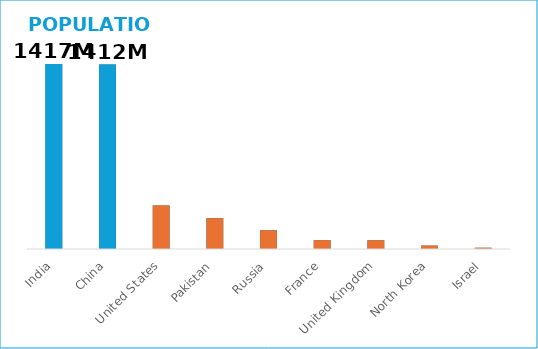
| Category | POPULATION |
|---|---|
| India | 1417173173 |
| China | 1412175000 |
| United States | 0 |
| Pakistan | 0 |
| Russia | 0 |
| France | 0 |
| United Kingdom | 0 |
| North Korea | 0 |
| Israel | 0 |